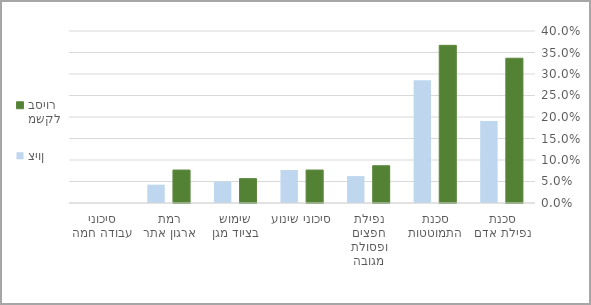
| Category | משקל בסיור | ציון |
|---|---|---|
| סכנת נפילת אדם | 0.337 | 0.19 |
| סכנת התמוטטות | 0.367 | 0.285 |
| נפילת חפצים ופסולת מגובה | 0.087 | 0.063 |
| סיכוני שינוע | 0.077 | 0.077 |
| שימוש בציוד מגן | 0.057 | 0.05 |
| רמת ארגון אתר | 0.077 | 0.043 |
| סיכוני עבודה חמה | 0 | 0 |